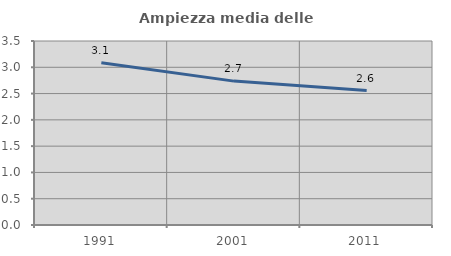
| Category | Ampiezza media delle famiglie |
|---|---|
| 1991.0 | 3.084 |
| 2001.0 | 2.737 |
| 2011.0 | 2.557 |